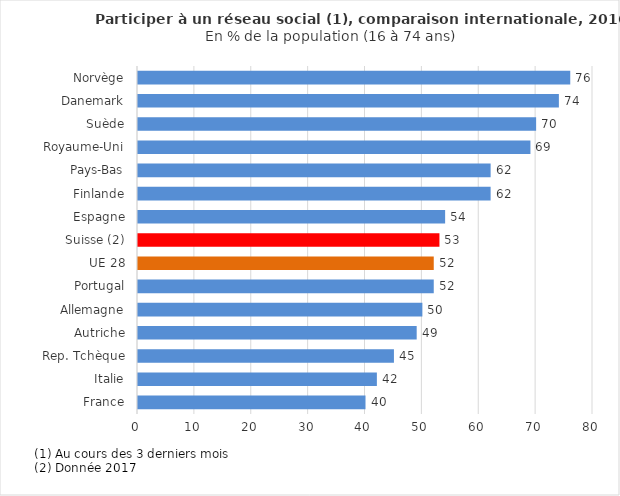
| Category | Series 0 |
|---|---|
| France | 40 |
| Italie | 42 |
| Rep. Tchèque | 45 |
| Autriche | 49 |
| Allemagne | 50 |
| Portugal | 52 |
| UE 28 | 52 |
| Suisse (2) | 53 |
| Espagne | 54 |
| Finlande | 62 |
| Pays-Bas | 62 |
| Royaume-Uni | 69 |
| Suède | 70 |
| Danemark | 74 |
| Norvège | 76 |